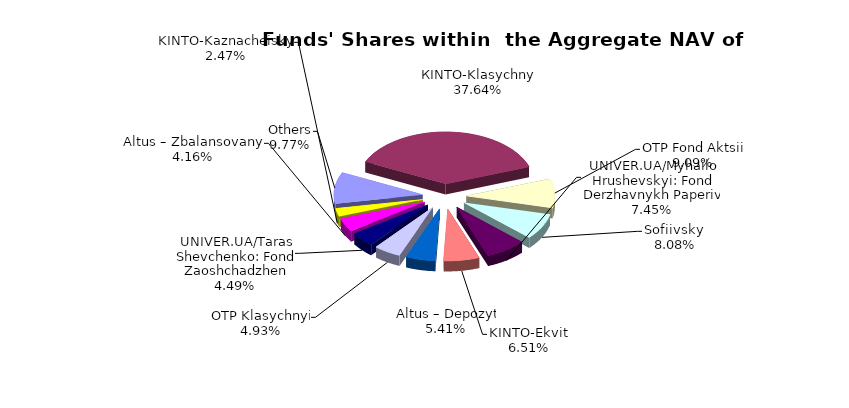
| Category | Series 0 | Series 1 |
|---|---|---|
| Others | 6814923.51 | 0.098 |
| КІNТО-Klasychnyi | 26259321.4 | 0.376 |
| ОТP Fond Aktsii | 6338887.04 | 0.091 |
| Sofiivskyi | 5638097.94 | 0.081 |
| UNIVER.UA/Myhailo Hrushevskyi: Fond Derzhavnykh Paperiv | 5195875.72 | 0.074 |
| KINTO-Ekviti | 4542968.6 | 0.065 |
| Altus – Depozyt | 3774851.39 | 0.054 |
| ОТP Klasychnyi | 3439598.34 | 0.049 |
| UNIVER.UA/Taras Shevchenko: Fond Zaoshchadzhen | 3134760.66 | 0.045 |
| Altus – Zbalansovanyi | 2902927.87 | 0.042 |
| KINTO-Kaznacheiskyi | 1726431.01 | 0.025 |